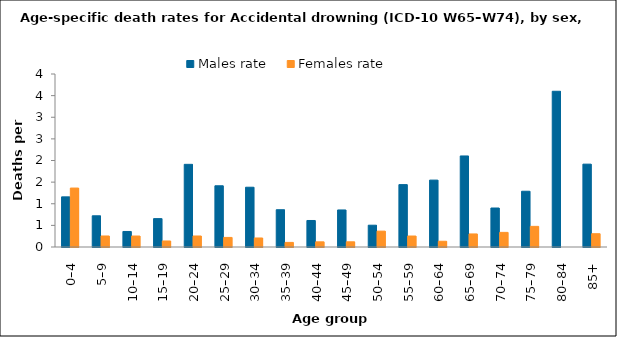
| Category | Males rate | Females rate |
|---|---|---|
| 0–4 | 1.159 | 1.363 |
| 5–9 | 0.722 | 0.255 |
| 10–14 | 0.359 | 0.254 |
| 15–19 | 0.656 | 0.139 |
| 20–24 | 1.911 | 0.254 |
| 25–29 | 1.415 | 0.221 |
| 30–34 | 1.382 | 0.209 |
| 35–39 | 0.862 | 0.106 |
| 40–44 | 0.613 | 0.119 |
| 45–49 | 0.856 | 0.12 |
| 50–54 | 0.504 | 0.367 |
| 55–59 | 1.443 | 0.254 |
| 60–64 | 1.547 | 0.133 |
| 65–69 | 2.105 | 0.302 |
| 70–74 | 0.901 | 0.338 |
| 75–79 | 1.289 | 0.477 |
| 80–84 | 3.601 | 0 |
| 85+ | 1.916 | 0.307 |